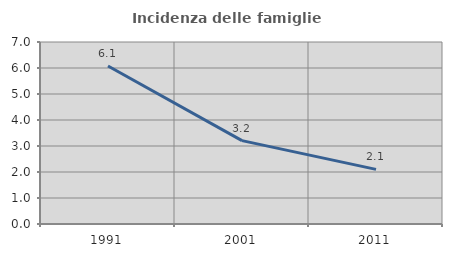
| Category | Incidenza delle famiglie numerose |
|---|---|
| 1991.0 | 6.075 |
| 2001.0 | 3.206 |
| 2011.0 | 2.102 |